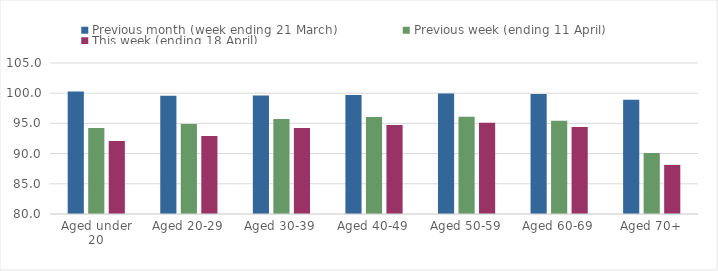
| Category | Previous month (week ending 21 March) | Previous week (ending 11 April) | This week (ending 18 April) |
|---|---|---|---|
| Aged under 20 | 100.266 | 94.242 | 92.074 |
| Aged 20-29 | 99.559 | 94.886 | 92.923 |
| Aged 30-39 | 99.634 | 95.749 | 94.222 |
| Aged 40-49 | 99.703 | 96.056 | 94.729 |
| Aged 50-59 | 99.938 | 96.112 | 95.099 |
| Aged 60-69 | 99.868 | 95.442 | 94.391 |
| Aged 70+ | 98.92 | 90.112 | 88.134 |